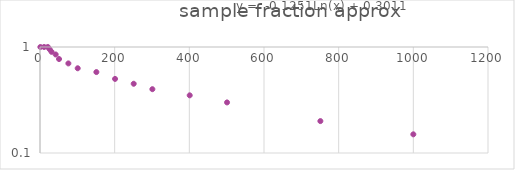
| Category | Series 0 |
|---|---|
| 1.0 | 1 |
| 11.0 | 1 |
| 21.0 | 1 |
| 26.0 | 0.95 |
| 31.0 | 0.9 |
| 42.0 | 0.85 |
| 51.0 | 0.77 |
| 76.0 | 0.7 |
| 101.0 | 0.63 |
| 151.0 | 0.58 |
| 201.0 | 0.5 |
| 251.0 | 0.45 |
| 301.0 | 0.4 |
| 401.0 | 0.35 |
| 501.0 | 0.3 |
| 751.0 | 0.2 |
| 1000.0 | 0.15 |